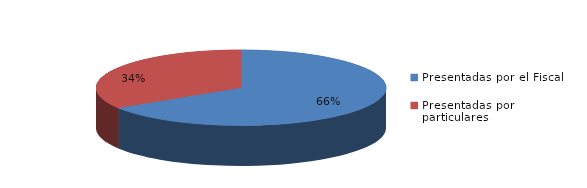
| Category | Series 0 |
|---|---|
| Presentadas por el Fiscal | 178 |
| Presentadas por particulares | 92 |